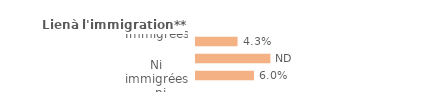
| Category | Series 0 |
|---|---|
| Immigrées | 0.043 |
| Descendantes d'immigré(s) | 0.077 |
| Ni immigrées, ni descendantes | 0.06 |